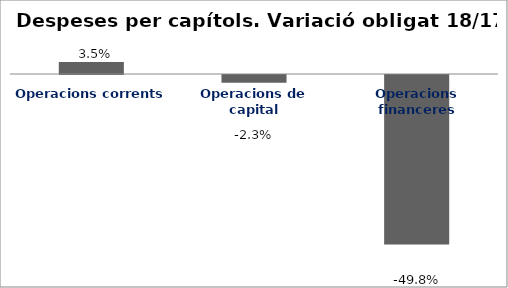
| Category | Series 0 |
|---|---|
| Operacions corrents | 0.035 |
| Operacions de capital | -0.023 |
| Operacions financeres | -0.498 |